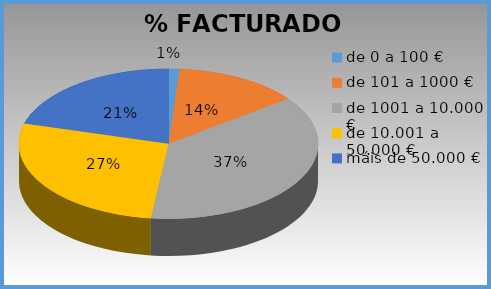
| Category | Series 0 |
|---|---|
| de 0 a 100 € | 0.012 |
| de 101 a 1000 € | 0.135 |
| de 1001 a 10.000 € | 0.372 |
| de 10.001 a 50.000 € | 0.275 |
| máis de 50.000 € | 0.206 |